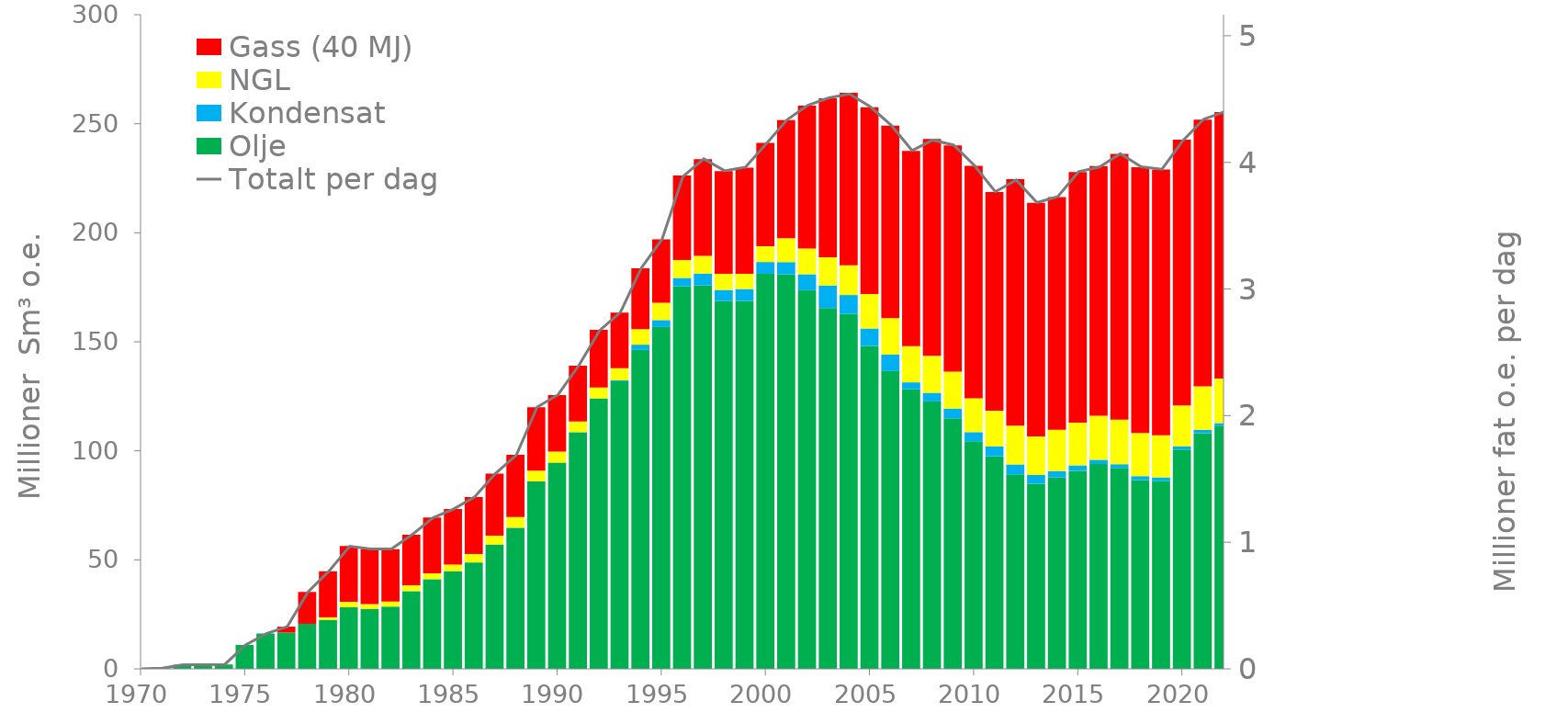
| Category | Olje | Kondensat | NGL | Gass (40 MJ) |
|---|---|---|---|---|
| 1970.0 | 0 | 0 | 0 | 0 |
| 1971.0 | 0.357 | 0 | 0 | 0 |
| 1972.0 | 1.927 | 0 | 0 | 0 |
| 1973.0 | 1.87 | 0 | 0 | 0 |
| 1974.0 | 2.014 | 0 | 0 | 0 |
| 1975.0 | 10.995 | 0 | 0 | 0 |
| 1976.0 | 16.227 | 0 | 0 | 0 |
| 1977.0 | 16.643 | 0.002 | 0 | 2.722 |
| 1978.0 | 20.644 | 0.021 | 0 | 14.617 |
| 1979.0 | 22.478 | 0.044 | 1.128 | 21.113 |
| 1980.0 | 28.221 | 0.048 | 2.44 | 25.637 |
| 1981.0 | 27.485 | 0.048 | 2.168 | 25.281 |
| 1982.0 | 28.528 | 0.043 | 2.286 | 24.059 |
| 1983.0 | 35.645 | 0.041 | 2.68 | 23.168 |
| 1984.0 | 41.093 | 0.064 | 2.642 | 25.635 |
| 1985.0 | 44.758 | 0.076 | 2.968 | 25.514 |
| 1986.0 | 48.771 | 0.061 | 3.845 | 26.147 |
| 1987.0 | 56.959 | 0.055 | 4.117 | 28.404 |
| 1988.0 | 64.723 | 0.047 | 4.846 | 28.585 |
| 1989.0 | 85.983 | 0.053 | 4.898 | 29.079 |
| 1990.0 | 94.542 | 0.048 | 5.011 | 25.986 |
| 1991.0 | 108.51 | 0.057 | 4.897 | 25.562 |
| 1992.0 | 123.999 | 0.054 | 4.959 | 26.5 |
| 1993.0 | 131.843 | 0.474 | 5.518 | 25.562 |
| 1994.0 | 146.282 | 2.403 | 7.122 | 27.879 |
| 1995.0 | 156.776 | 3.178 | 7.942 | 29.068 |
| 1996.0 | 175.501 | 3.784 | 8.232 | 38.749 |
| 1997.0 | 175.914 | 5.376 | 8.074 | 44.356 |
| 1998.0 | 168.744 | 5.047 | 7.39 | 47.055 |
| 1999.0 | 168.69 | 5.512 | 6.992 | 48.698 |
| 2000.0 | 181.181 | 5.411 | 7.225 | 47.432 |
| 2001.0 | 180.884 | 5.666 | 10.924 | 54.148 |
| 2002.0 | 173.649 | 7.323 | 11.798 | 65.533 |
| 2003.0 | 165.475 | 10.339 | 12.931 | 72.934 |
| 2004.0 | 162.778 | 8.675 | 13.643 | 79.095 |
| 2005.0 | 148.137 | 7.952 | 15.806 | 85.667 |
| 2006.0 | 136.577 | 7.625 | 16.696 | 88.227 |
| 2007.0 | 128.276 | 3.126 | 16.629 | 89.505 |
| 2008.0 | 122.662 | 3.924 | 16.942 | 99.463 |
| 2009.0 | 114.937 | 4.44 | 16.962 | 103.68 |
| 2010.0 | 104.39 | 4.17 | 15.55 | 106.53 |
| 2011.0 | 97.46 | 4.58 | 16.31 | 100.3 |
| 2012.0 | 89.2 | 4.57 | 17.8 | 113.06 |
| 2013.0 | 84.94 | 3.99 | 17.72 | 107.05 |
| 2014.0 | 87.75 | 2.91 | 18.95 | 106.8 |
| 2015.0 | 90.85 | 2.47 | 19.6 | 114.92 |
| 2016.0 | 93.96 | 1.93 | 20.18 | 114.53 |
| 2017.0 | 92.15 | 1.71 | 20.39 | 121.87 |
| 2018.0 | 86.6 | 1.78 | 19.84 | 121.86 |
| 2019.0 | 86.13 | 1.69 | 19.28 | 121.86 |
| 2020.0 | 100.62 | 1.5 | 18.7 | 121.86 |
| 2021.0 | 108.11 | 1.5 | 19.95 | 122.32 |
| 2022.0 | 111.31 | 1.4 | 20.45 | 122.13 |